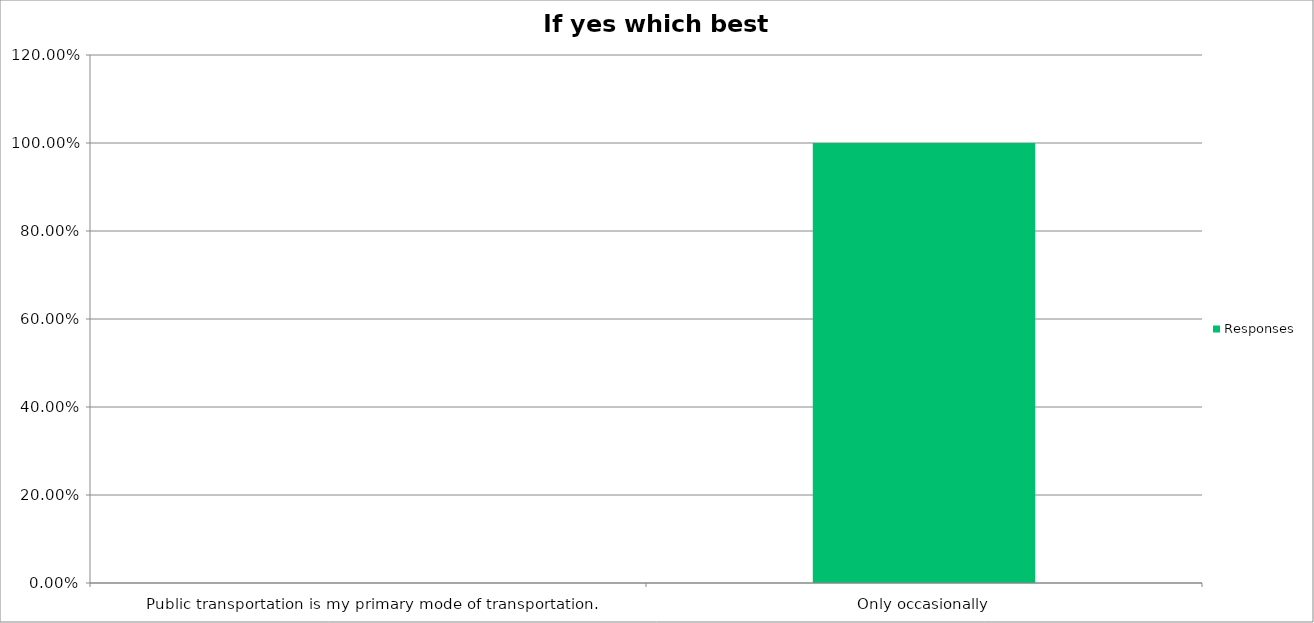
| Category | Responses |
|---|---|
| Public transportation is my primary mode of transportation. | 0 |
| Only occasionally | 1 |